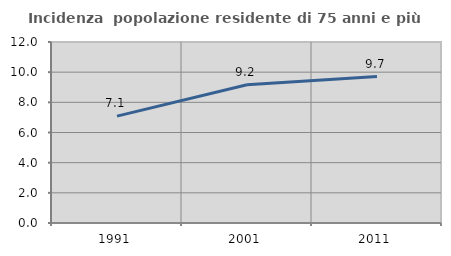
| Category | Incidenza  popolazione residente di 75 anni e più |
|---|---|
| 1991.0 | 7.083 |
| 2001.0 | 9.163 |
| 2011.0 | 9.705 |